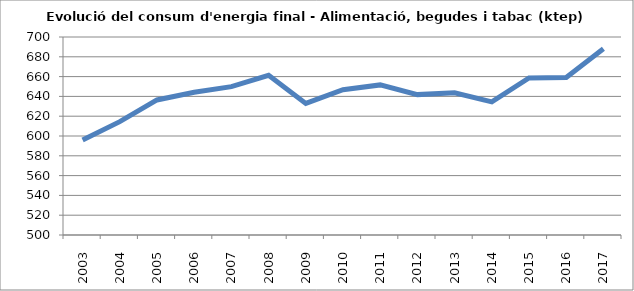
| Category | 595,9 614,5 636,4 644,2 649,9 661,3 632,9 646,7 651,6 641,8 643,7 634,5 658,6 659,2 688,2 |
|---|---|
| 2003.0 | 595.9 |
| 2004.0 | 614.5 |
| 2005.0 | 636.4 |
| 2006.0 | 644.2 |
| 2007.0 | 649.9 |
| 2008.0 | 661.3 |
| 2009.0 | 632.9 |
| 2010.0 | 646.7 |
| 2011.0 | 651.6 |
| 2012.0 | 641.8 |
| 2013.0 | 643.7 |
| 2014.0 | 634.5 |
| 2015.0 | 658.6 |
| 2016.0 | 659.2 |
| 2017.0 | 688.2 |